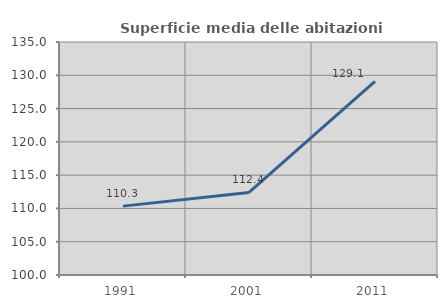
| Category | Superficie media delle abitazioni occupate |
|---|---|
| 1991.0 | 110.347 |
| 2001.0 | 112.395 |
| 2011.0 | 129.088 |